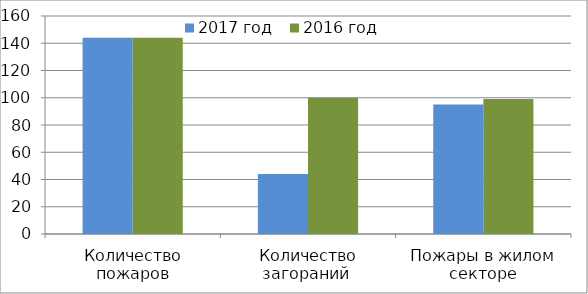
| Category | 2017 год | 2016 год |
|---|---|---|
| Количество пожаров | 144 | 144 |
| Количество загораний  | 44 | 100 |
| Пожары в жилом секторе | 95 | 99 |